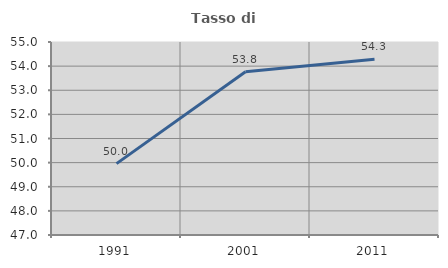
| Category | Tasso di occupazione   |
|---|---|
| 1991.0 | 49.959 |
| 2001.0 | 53.771 |
| 2011.0 | 54.286 |